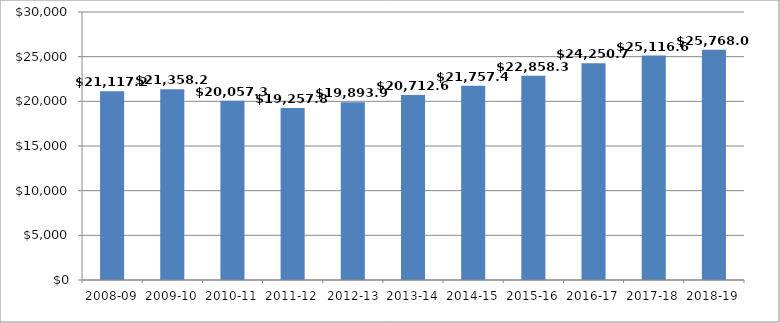
| Category | Series 0 |
|---|---|
| 2008-09 | 21117.209 |
| 2009-10 | 21358.225 |
| 2010-11 | 20057.381 |
| 2011-12 | 19257.842 |
| 2012-13_x000d_ | 19893.983 |
| 2013-14 | 20712.681 |
| 2014-15 | 21757.472 |
| 2015-16 | 22858.355 |
| 2016-17 | 24250.757 |
| 2017-18 | 25116.656 |
| 2018-19 | 25768.02 |